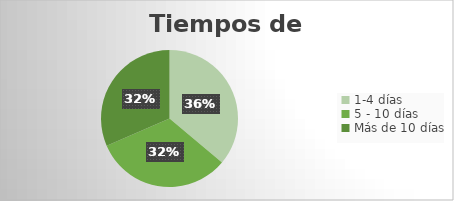
| Category | 1-4 días 5 - 10 días Más de 10 días |
|---|---|
| 1-4 días | 533 |
| 5 - 10 días | 478 |
| Más de 10 días | 465 |